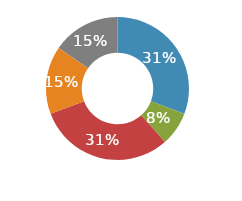
| Category | Series 0 |
|---|---|
| Transportation | 0.308 |
| Lodging | 0.077 |
| Food | 0.308 |
| Entertainment | 0.154 |
| Other | 0.154 |